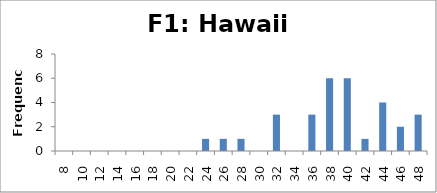
| Category | Frequency |
|---|---|
| 8.0 | 0 |
| 10.0 | 0 |
| 12.0 | 0 |
| 14.0 | 0 |
| 16.0 | 0 |
| 18.0 | 0 |
| 20.0 | 0 |
| 22.0 | 0 |
| 24.0 | 1 |
| 26.0 | 1 |
| 28.0 | 1 |
| 30.0 | 0 |
| 32.0 | 3 |
| 34.0 | 0 |
| 36.0 | 3 |
| 38.0 | 6 |
| 40.0 | 6 |
| 42.0 | 1 |
| 44.0 | 4 |
| 46.0 | 2 |
| 48.0 | 3 |